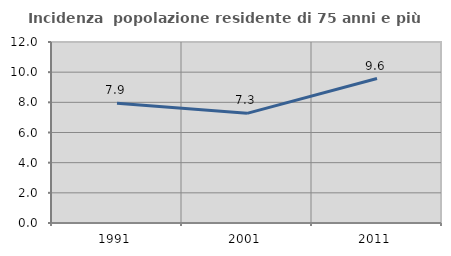
| Category | Incidenza  popolazione residente di 75 anni e più |
|---|---|
| 1991.0 | 7.935 |
| 2001.0 | 7.271 |
| 2011.0 | 9.579 |